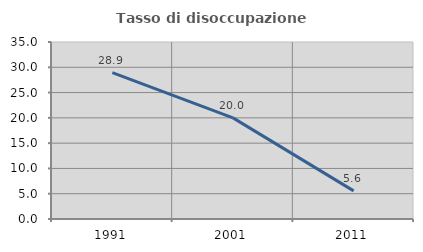
| Category | Tasso di disoccupazione giovanile  |
|---|---|
| 1991.0 | 28.947 |
| 2001.0 | 20 |
| 2011.0 | 5.556 |